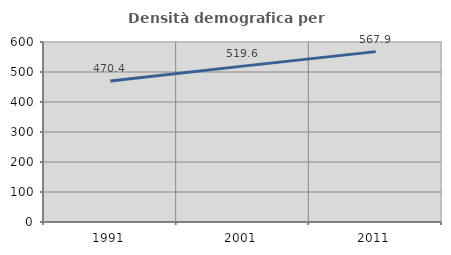
| Category | Densità demografica |
|---|---|
| 1991.0 | 470.354 |
| 2001.0 | 519.561 |
| 2011.0 | 567.897 |